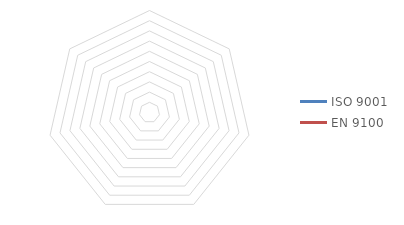
| Category | ISO 9001 | EN 9100 |
|---|---|---|
| Article 8.1  : Planification et maîtrise opérationnelles | 0 | 0 |
| Article 8.2  : Exigences relatives aux produits et services | 0 | 0 |
| Article 8.3  : Conception et développement de produits et services | 0 | 0 |
| Article 8.4 : Maîtrise des processus, produits et services fournis par des prestataires externes | 0 | 0 |
| Article 8.5  : Production et prestation de service | 0 | 0 |
| Article 8.6  : Libération des produits et services | 0 | 0 |
| Article 8.7  : Maîtrise des éléments de sortie non conformes | 0 | 0 |